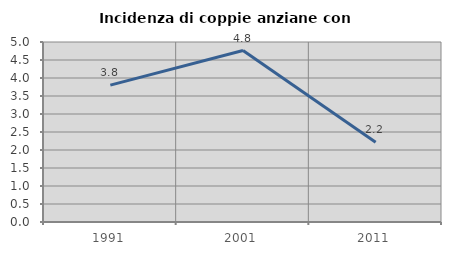
| Category | Incidenza di coppie anziane con figli |
|---|---|
| 1991.0 | 3.802 |
| 2001.0 | 4.762 |
| 2011.0 | 2.212 |